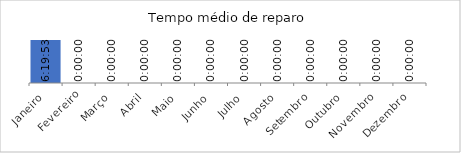
| Category | Tempo médio de reparo |
|---|---|
| Janeiro | 0.264 |
| Fevereiro | 0 |
| Março | 0 |
| Abril | 0 |
| Maio | 0 |
| Junho | 0 |
| Julho | 0 |
| Agosto | 0 |
| Setembro | 0 |
| Outubro | 0 |
| Novembro | 0 |
| Dezembro | 0 |